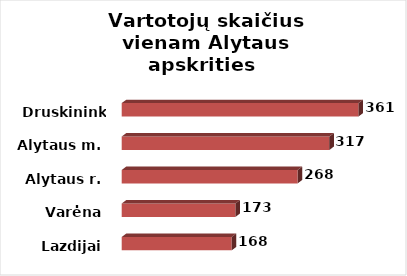
| Category | Series 0 |
|---|---|
| Lazdijai | 167.639 |
| Varėna | 173.455 |
| Alytaus r. | 268.176 |
| Alytaus m. | 316.538 |
| Druskininkai | 361 |